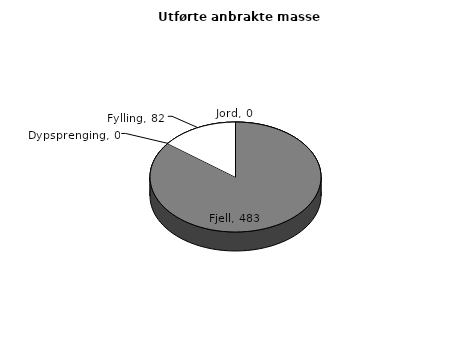
| Category | Jord |
|---|---|
| Jord | 0 |
| Fjell | 482.598 |
| Dypsprenging | 0 |
| Fylling | 82.084 |